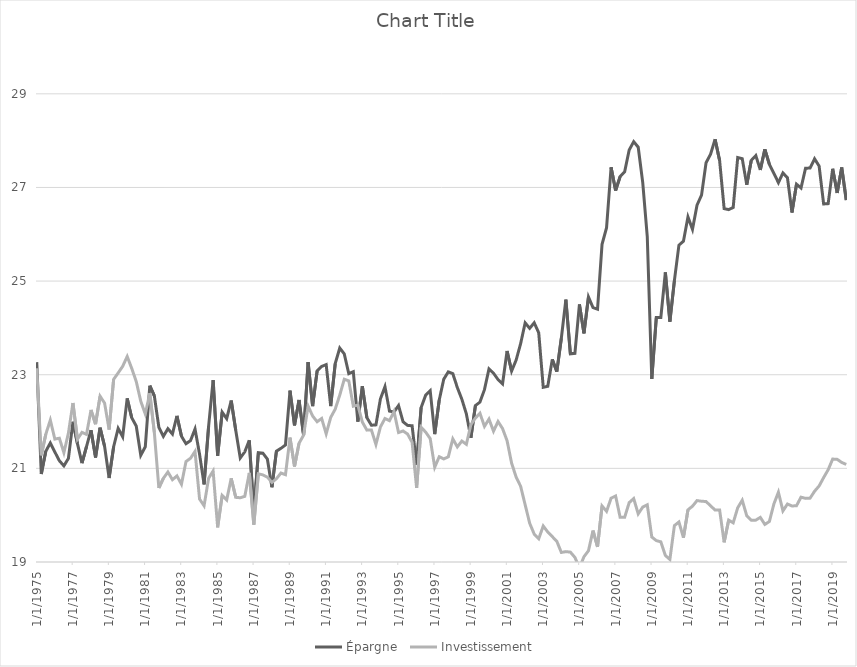
| Category | Épargne  | Investissement  |
|---|---|---|
| 1/1/75 | 23.268 | 23.138 |
| 4/1/75 | 20.879 | 21.279 |
| 7/1/75 | 21.365 | 21.729 |
| 10/1/75 | 21.542 | 22.031 |
| 1/1/76 | 21.349 | 21.625 |
| 4/1/76 | 21.163 | 21.644 |
| 7/1/76 | 21.053 | 21.335 |
| 10/1/76 | 21.212 | 21.752 |
| 1/1/77 | 21.996 | 22.396 |
| 4/1/77 | 21.528 | 21.624 |
| 7/1/77 | 21.111 | 21.769 |
| 10/1/77 | 21.465 | 21.726 |
| 1/1/78 | 21.817 | 22.248 |
| 4/1/78 | 21.233 | 21.944 |
| 7/1/78 | 21.869 | 22.541 |
| 10/1/78 | 21.471 | 22.394 |
| 1/1/79 | 20.793 | 21.829 |
| 4/1/79 | 21.463 | 22.902 |
| 7/1/79 | 21.856 | 23.038 |
| 10/1/79 | 21.675 | 23.18 |
| 1/1/80 | 22.494 | 23.389 |
| 4/1/80 | 22.08 | 23.135 |
| 7/1/80 | 21.904 | 22.856 |
| 10/1/80 | 21.278 | 22.434 |
| 1/1/81 | 21.46 | 22.161 |
| 4/1/81 | 22.765 | 22.606 |
| 7/1/81 | 22.549 | 21.767 |
| 10/1/81 | 21.878 | 20.581 |
| 1/1/82 | 21.685 | 20.788 |
| 4/1/82 | 21.848 | 20.922 |
| 7/1/82 | 21.734 | 20.758 |
| 10/1/82 | 22.121 | 20.839 |
| 1/1/83 | 21.687 | 20.66 |
| 4/1/83 | 21.526 | 21.145 |
| 7/1/83 | 21.593 | 21.216 |
| 10/1/83 | 21.841 | 21.361 |
| 1/1/84 | 21.302 | 20.346 |
| 4/1/84 | 20.657 | 20.201 |
| 7/1/84 | 21.897 | 20.788 |
| 10/1/84 | 22.887 | 20.944 |
| 1/1/85 | 21.27 | 19.74 |
| 4/1/85 | 22.2 | 20.423 |
| 7/1/85 | 22.062 | 20.327 |
| 10/1/85 | 22.449 | 20.787 |
| 1/1/86 | 21.813 | 20.381 |
| 4/1/86 | 21.221 | 20.372 |
| 7/1/86 | 21.353 | 20.402 |
| 10/1/86 | 21.599 | 20.901 |
| 1/1/87 | 20.036 | 19.799 |
| 4/1/87 | 21.334 | 20.884 |
| 7/1/87 | 21.325 | 20.861 |
| 10/1/87 | 21.197 | 20.813 |
| 1/1/88 | 20.598 | 20.699 |
| 4/1/88 | 21.367 | 20.777 |
| 7/1/88 | 21.428 | 20.9 |
| 10/1/88 | 21.5 | 20.865 |
| 1/1/89 | 22.661 | 21.657 |
| 4/1/89 | 21.919 | 21.041 |
| 7/1/89 | 22.461 | 21.537 |
| 10/1/89 | 21.712 | 21.707 |
| 1/1/90 | 23.271 | 22.332 |
| 4/1/90 | 22.329 | 22.119 |
| 7/1/90 | 23.082 | 21.996 |
| 10/1/90 | 23.177 | 22.066 |
| 1/1/91 | 23.216 | 21.737 |
| 4/1/91 | 22.33 | 22.088 |
| 7/1/91 | 23.238 | 22.265 |
| 10/1/91 | 23.57 | 22.564 |
| 1/1/92 | 23.446 | 22.904 |
| 4/1/92 | 23.022 | 22.869 |
| 7/1/92 | 23.064 | 22.328 |
| 10/1/92 | 21.998 | 22.352 |
| 1/1/93 | 22.756 | 21.988 |
| 4/1/93 | 22.082 | 21.817 |
| 7/1/93 | 21.921 | 21.82 |
| 10/1/93 | 21.929 | 21.511 |
| 1/1/94 | 22.486 | 21.886 |
| 4/1/94 | 22.745 | 22.065 |
| 7/1/94 | 22.222 | 22.019 |
| 10/1/94 | 22.205 | 22.215 |
| 1/1/95 | 22.342 | 21.765 |
| 4/1/95 | 21.995 | 21.799 |
| 7/1/95 | 21.918 | 21.733 |
| 10/1/95 | 21.91 | 21.556 |
| 1/1/96 | 21.072 | 20.581 |
| 4/1/96 | 22.301 | 21.878 |
| 7/1/96 | 22.564 | 21.774 |
| 10/1/96 | 22.659 | 21.636 |
| 1/1/97 | 21.73 | 21.024 |
| 4/1/97 | 22.46 | 21.249 |
| 7/1/97 | 22.905 | 21.202 |
| 10/1/97 | 23.061 | 21.246 |
| 1/1/98 | 23.024 | 21.63 |
| 4/1/98 | 22.726 | 21.459 |
| 7/1/98 | 22.476 | 21.584 |
| 10/1/98 | 22.163 | 21.513 |
| 1/1/99 | 21.652 | 21.933 |
| 4/1/99 | 22.343 | 22.074 |
| 7/1/99 | 22.415 | 22.177 |
| 10/1/99 | 22.681 | 21.896 |
| 1/1/00 | 23.124 | 22.052 |
| 4/1/00 | 23.034 | 21.794 |
| 7/1/00 | 22.896 | 22.001 |
| 10/1/00 | 22.806 | 21.85 |
| 1/1/01 | 23.507 | 21.59 |
| 4/1/01 | 23.078 | 21.113 |
| 7/1/01 | 23.312 | 20.814 |
| 10/1/01 | 23.666 | 20.617 |
| 1/1/02 | 24.108 | 20.221 |
| 4/1/02 | 23.991 | 19.827 |
| 7/1/02 | 24.11 | 19.596 |
| 10/1/02 | 23.896 | 19.497 |
| 1/1/03 | 22.731 | 19.769 |
| 4/1/03 | 22.753 | 19.64 |
| 7/1/03 | 23.328 | 19.542 |
| 10/1/03 | 23.066 | 19.442 |
| 1/1/04 | 23.779 | 19.204 |
| 4/1/04 | 24.603 | 19.222 |
| 7/1/04 | 23.446 | 19.211 |
| 10/1/04 | 23.457 | 19.098 |
| 1/1/05 | 24.501 | 18.873 |
| 4/1/05 | 23.884 | 19.112 |
| 7/1/05 | 24.659 | 19.241 |
| 10/1/05 | 24.432 | 19.672 |
| 1/1/06 | 24.399 | 19.323 |
| 4/1/06 | 25.785 | 20.197 |
| 7/1/06 | 26.14 | 20.082 |
| 10/1/06 | 27.432 | 20.363 |
| 1/1/07 | 26.934 | 20.411 |
| 4/1/07 | 27.233 | 19.955 |
| 7/1/07 | 27.336 | 19.955 |
| 10/1/07 | 27.801 | 20.268 |
| 1/1/08 | 27.98 | 20.355 |
| 4/1/08 | 27.86 | 20.027 |
| 7/1/08 | 27.103 | 20.173 |
| 10/1/08 | 25.952 | 20.222 |
| 1/1/09 | 22.909 | 19.534 |
| 4/1/09 | 24.222 | 19.457 |
| 7/1/09 | 24.223 | 19.431 |
| 10/1/09 | 25.186 | 19.14 |
| 1/1/10 | 24.134 | 19.054 |
| 4/1/10 | 25.008 | 19.777 |
| 7/1/10 | 25.767 | 19.854 |
| 10/1/10 | 25.852 | 19.52 |
| 1/1/11 | 26.371 | 20.114 |
| 4/1/11 | 26.106 | 20.192 |
| 7/1/11 | 26.62 | 20.312 |
| 10/1/11 | 26.837 | 20.298 |
| 1/1/12 | 27.528 | 20.292 |
| 4/1/12 | 27.709 | 20.2 |
| 7/1/12 | 28.029 | 20.109 |
| 10/1/12 | 27.574 | 20.112 |
| 1/1/13 | 26.548 | 19.42 |
| 4/1/13 | 26.527 | 19.894 |
| 7/1/13 | 26.572 | 19.837 |
| 10/1/13 | 27.639 | 20.159 |
| 1/1/14 | 27.615 | 20.319 |
| 4/1/14 | 27.057 | 19.987 |
| 7/1/14 | 27.578 | 19.893 |
| 10/1/14 | 27.68 | 19.894 |
| 1/1/15 | 27.374 | 19.953 |
| 4/1/15 | 27.815 | 19.803 |
| 7/1/15 | 27.495 | 19.865 |
| 10/1/15 | 27.302 | 20.24 |
| 1/1/16 | 27.102 | 20.491 |
| 4/1/16 | 27.31 | 20.092 |
| 7/1/16 | 27.206 | 20.238 |
| 10/1/16 | 26.465 | 20.196 |
| 1/1/17 | 27.07 | 20.202 |
| 4/1/17 | 26.988 | 20.385 |
| 7/1/17 | 27.411 | 20.359 |
| 10/1/17 | 27.414 | 20.364 |
| 1/1/18 | 27.612 | 20.512 |
| 4/1/18 | 27.457 | 20.624 |
| 7/1/18 | 26.648 | 20.803 |
| 10/1/18 | 26.654 | 20.97 |
| 1/1/19 | 27.399 | 21.199 |
| 4/1/19 | 26.883 | 21.192 |
| 7/1/19 | 27.427 | 21.127 |
| 10/1/19 | 26.73 | 21.083 |